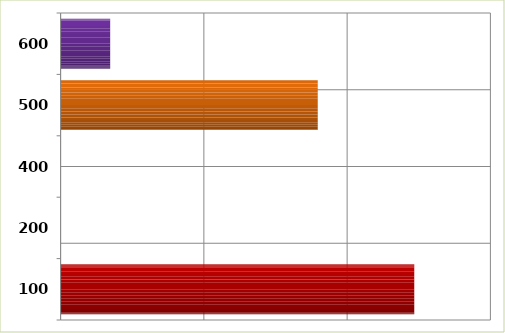
| Category | Series 0 |
|---|---|
| 100.0 | 1234285924 |
| 200.0 | 0 |
| 400.0 | 0 |
| 500.0 | 897412825 |
| 600.0 | 173051628 |